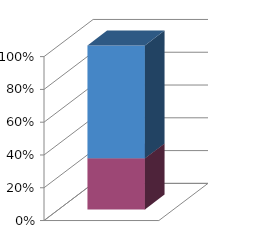
| Category | Series 2 | Series 1 |
|---|---|---|
| 0 | 31180 | 68820 |